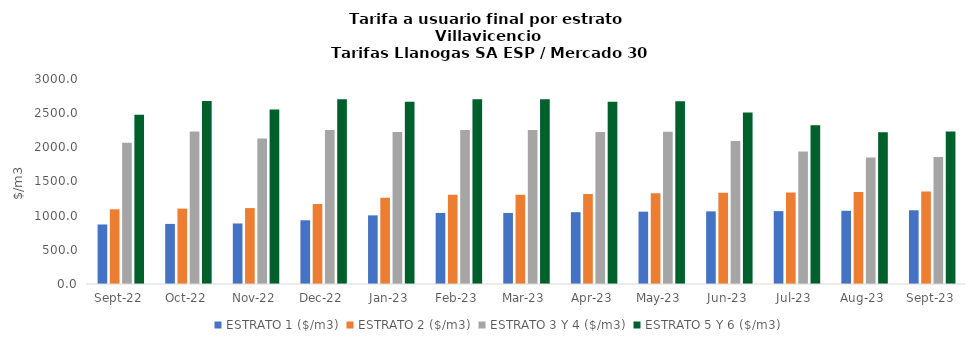
| Category | ESTRATO 1 ($/m3) | ESTRATO 2 ($/m3) | ESTRATO 3 Y 4 ($/m3) | ESTRATO 5 Y 6 ($/m3) |
|---|---|---|---|---|
| 2022-09-01 | 871.27 | 1093.08 | 2065.26 | 2478.312 |
| 2022-10-01 | 879.42 | 1103.3 | 2232.86 | 2679.432 |
| 2022-11-01 | 885.71 | 1111.19 | 2128.04 | 2553.648 |
| 2022-12-01 | 932.64 | 1170.28 | 2251.92 | 2702.304 |
| 2023-01-01 | 1004.76 | 1260.83 | 2223.64 | 2668.368 |
| 2023-02-01 | 1039.76 | 1304.76 | 2251.92 | 2702.304 |
| 2023-03-01 | 1039.76 | 1304.76 | 2251.92 | 2702.304 |
| 2023-04-01 | 1050.8 | 1318.62 | 2223.64 | 2668.368 |
| 2023-05-01 | 1058.67 | 1328.49 | 2227.49 | 2672.988 |
| 2023-06-01 | 1063.04 | 1333.97 | 2092.35 | 2510.82 |
| 2023-07-01 | 1066.3 | 1338.06 | 1937.39 | 2324.868 |
| 2023-08-01 | 1071.54 | 1344.64 | 1852.08 | 2222.496 |
| 2023-09-01 | 1079.09 | 1354.11 | 1858.9 | 2230.68 |